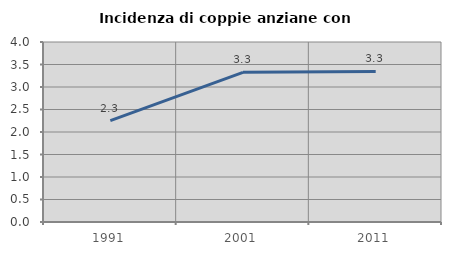
| Category | Incidenza di coppie anziane con figli |
|---|---|
| 1991.0 | 2.253 |
| 2001.0 | 3.326 |
| 2011.0 | 3.346 |